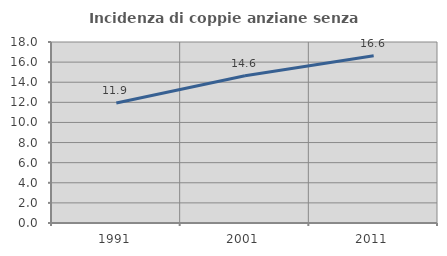
| Category | Incidenza di coppie anziane senza figli  |
|---|---|
| 1991.0 | 11.931 |
| 2001.0 | 14.639 |
| 2011.0 | 16.637 |